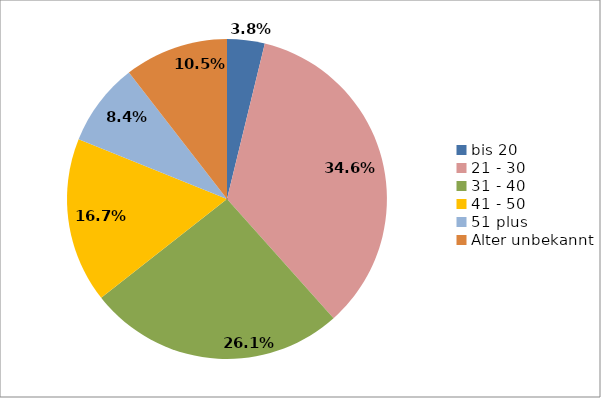
| Category | Series 0 |
|---|---|
| bis 20 | 0.038 |
| 21 - 30 | 0.346 |
| 31 - 40 | 0.26 |
| 41 - 50 | 0.167 |
| 51 plus | 0.084 |
| Alter unbekannt | 0.105 |